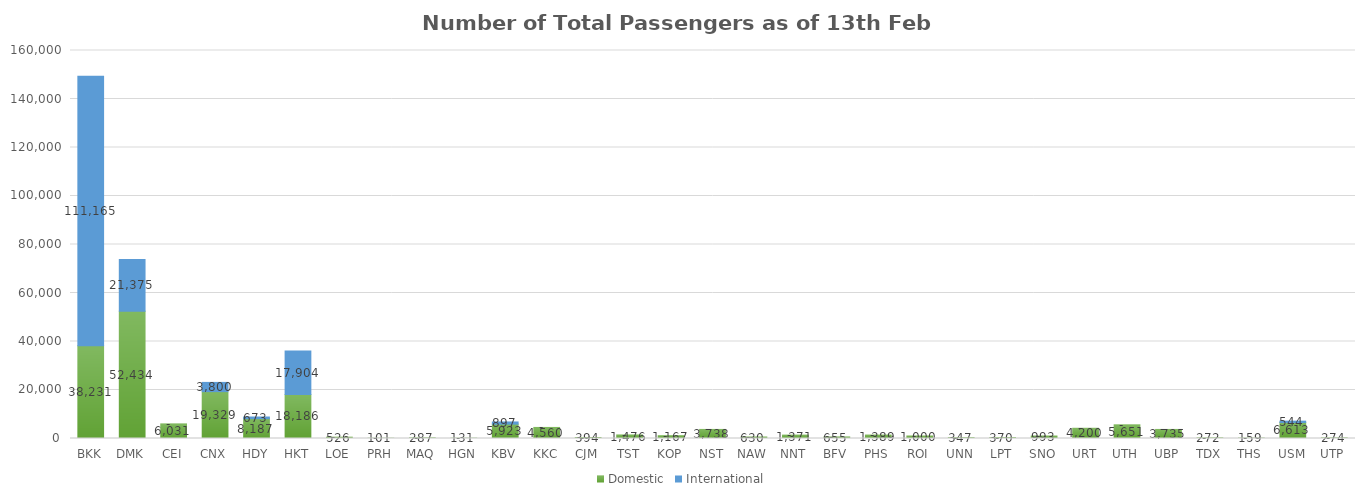
| Category | Domestic | International |
|---|---|---|
| BKK | 38231 | 111165 |
| DMK | 52434 | 21375 |
| CEI | 6031 | 0 |
| CNX | 19329 | 3800 |
| HDY | 8187 | 673 |
| HKT | 18186 | 17904 |
| LOE | 526 | 0 |
| PRH | 101 | 0 |
| MAQ | 287 | 0 |
| HGN | 131 | 0 |
| KBV | 5923 | 897 |
| KKC | 4560 | 0 |
| CJM | 394 | 0 |
| TST | 1476 | 0 |
| KOP | 1167 | 0 |
| NST | 3738 | 0 |
| NAW | 630 | 0 |
| NNT | 1371 | 0 |
| BFV | 655 | 0 |
| PHS | 1389 | 0 |
| ROI | 1000 | 0 |
| UNN | 347 | 0 |
| LPT | 370 | 0 |
| SNO | 993 | 0 |
| URT | 4200 | 0 |
| UTH | 5651 | 0 |
| UBP | 3735 | 0 |
| TDX | 272 | 0 |
| THS | 159 | 0 |
| USM | 6613 | 544 |
| UTP | 274 | 0 |